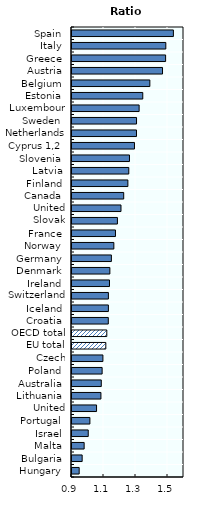
| Category | Foreign-born |
|---|---|
| Hungary | 0.945 |
| Bulgaria | 0.963 |
| Malta | 0.976 |
| Israel | 1.001 |
| Portugal | 1.012 |
| United Kingdom | 1.053 |
| Lithuania | 1.081 |
| Australia | 1.083 |
| Poland | 1.088 |
| Czech Republic | 1.093 |
| EU total (28) | 1.111 |
| OECD total (29) | 1.118 |
| Croatia | 1.127 |
| Iceland | 1.127 |
| Switzerland | 1.128 |
| Ireland | 1.134 |
| Denmark | 1.137 |
| Germany | 1.146 |
| Norway | 1.162 |
| France | 1.172 |
| Slovak Republic | 1.184 |
| United States | 1.206 |
| Canada | 1.223 |
| Finland | 1.249 |
| Latvia | 1.255 |
| Slovenia | 1.259 |
| Cyprus 1,2 | 1.29 |
| Netherlands | 1.303 |
| Sweden | 1.303 |
| Luxembourg | 1.32 |
| Estonia | 1.342 |
| Belgium | 1.387 |
| Austria | 1.466 |
| Greece | 1.485 |
| Italy | 1.486 |
| Spain | 1.534 |